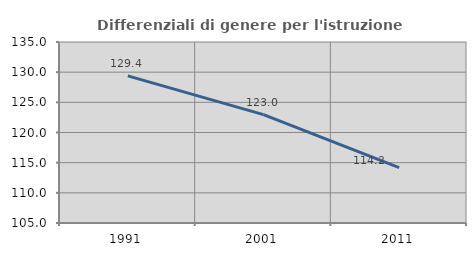
| Category | Differenziali di genere per l'istruzione superiore |
|---|---|
| 1991.0 | 129.38 |
| 2001.0 | 122.965 |
| 2011.0 | 114.189 |